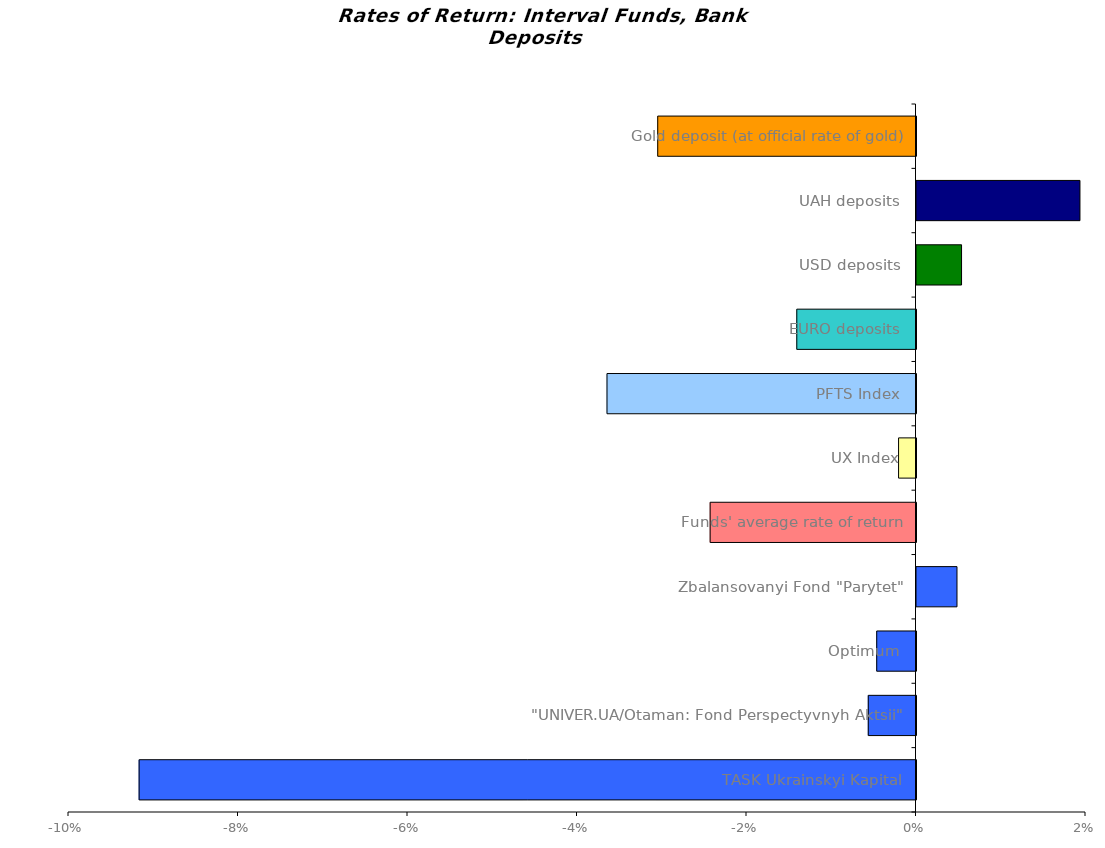
| Category | Series 0 |
|---|---|
| TASK Ukrainskyi Kapital | -0.092 |
| "UNIVER.UA/Otaman: Fond Perspectyvnyh Aktsii"  | -0.006 |
| Optimum | -0.005 |
| Zbalansovanyi Fond "Parytet" | 0.005 |
| Funds' average rate of return | -0.024 |
| UX Index | -0.002 |
| PFTS Index | -0.036 |
| EURO deposits | -0.014 |
| USD deposits | 0.005 |
| UAH deposits | 0.019 |
| Gold deposit (at official rate of gold) | -0.03 |